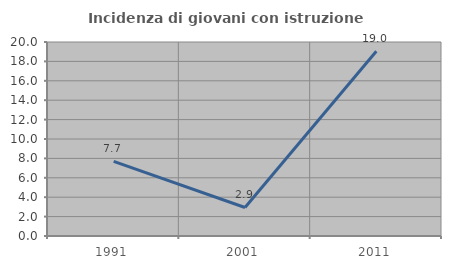
| Category | Incidenza di giovani con istruzione universitaria |
|---|---|
| 1991.0 | 7.692 |
| 2001.0 | 2.941 |
| 2011.0 | 19.048 |